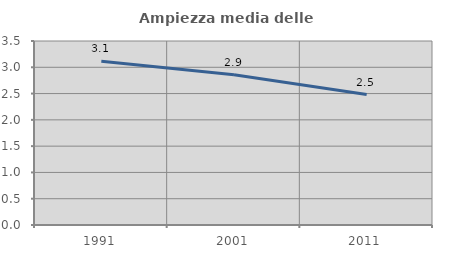
| Category | Ampiezza media delle famiglie |
|---|---|
| 1991.0 | 3.113 |
| 2001.0 | 2.859 |
| 2011.0 | 2.481 |